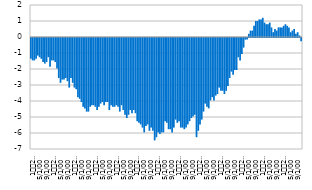
| Category |  Фискални резултат |
|---|---|
| 1
2007. | -1.3 |
| 2 | -1.4 |
| 3 | -1.4 |
| 4 | -1.3 |
| 5 | -1.1 |
| 6 | -1.2 |
| 7 | -1.3 |
| 8 | -1.5 |
| 9 | -1.6 |
| 10 | -1.5 |
| 11 | -1.2 |
| 12 | -1.8 |
| 1
2008. | -1.4 |
| 2 | -1.4 |
| 3 | -1.5 |
| 4 | -1.9 |
| 5 | -2.5 |
| 6 | -2.8 |
| 7 | -2.6 |
| 8 | -2.6 |
| 9 | -2.5 |
| 10 | -2.7 |
| 11 | -3.1 |
| 12 | -2.5 |
| 1
2009. | -2.8 |
| 2 | -3.1 |
| 3 | -3.2 |
| 4 | -3.7 |
| 5 | -3.8 |
| 6 | -4 |
| 7 | -4.3 |
| 8 | -4.4 |
| 9 | -4.6 |
| 10 | -4.6 |
| 11 | -4.3 |
| 12 | -4.2 |
| 1
2010. | -4.2 |
| 2 | -4.3 |
| 3 | -4.5 |
| 4 | -4.3 |
| 5 | -4.1 |
| 6 | -4 |
| 7 | -4.2 |
| 8 | -4 |
| 9 | -4 |
| 10 | -4.5 |
| 11 | -4.2 |
| 12 | -4.3 |
| 1
2011. | -4.3 |
| 2 | -4.2 |
| 3 | -4.3 |
| 4 | -4.6 |
| 5 | -4.2 |
| 6 | -4.5 |
| 7 | -4.8 |
| 8 | -5 |
| 9 | -4.8 |
| 10 | -4.5 |
| 11 | -4.7 |
| 12 | -4.5 |
| 1
2012. | -4.7 |
| 2 | -5.2 |
| 3 | -5.3 |
| 4 | -5.4 |
| 5 | -5.6 |
| 6 | -5.9 |
| 7 | -5.5 |
| 8 | -5.4 |
| 9 | -5.8 |
| 10 | -5.6 |
| 11 | -5.8 |
| 12 | -6.4 |
| 1
2013. | -6.2 |
| 2 | -5.9 |
| 3 | -6 |
| 4 | -5.9 |
| 5 | -5.9 |
| 6 | -5.2 |
| 7 | -5.3 |
| 8 | -5.7 |
| 9 | -5.7 |
| 10 | -5.9 |
| 11 | -5.6 |
| 12 | -5.1 |
| 1
2014. | -5.3 |
| 2 | -5.2 |
| 3 | -5.6 |
| 4 | -5.6 |
| 5 | -5.7 |
| 6 | -5.6 |
| 7 | -5.4 |
| 8 | -5.2 |
| 9 | -5 |
| 10 | -4.9 |
| 11 | -4.8 |
| 12 | -6.2 |
| 1
2015. | -5.8 |
| 2 | -5.4 |
| 3 | -5.1 |
| 4 | -4.6 |
| 5 | -4.1 |
| 6 | -4.3 |
| 7 | -4.4 |
| 8 | -3.9 |
| 9 | -3.7 |
| 10 | -3.9 |
| 11 | -3.6 |
| 12 | -3.5 |
| 1
2016. | -3.1 |
| 2 | -3.3 |
| 3 | -3.3 |
| 4 | -3.5 |
| 5 | -3.3 |
| 6 | -3 |
| 7 | -2.5 |
| 8 | -2.1 |
| 9 | -2.3 |
| 10 | -2 |
| 11 | -2 |
| 12 | -1.2 |
| 1
2017. | -1.4 |
| 2 | -1 |
| 3 | -0.6 |
| 4 | -0.1 |
| 5 | -0.1 |
| 6 | 0.2 |
| 7 | 0.4 |
| 8 | 0.4 |
| 9 | 0.7 |
| 10 | 1 |
| 11 | 1 |
| 12 | 1.1 |
| 1
2018. | 1.1 |
| 2 | 1.2 |
| 3 | 0.9 |
| 4 | 0.8 |
| 5 | 0.8 |
| 6 | 0.9 |
| 7 | 0.6 |
| 8 | 0.3 |
| 9 | 0.5 |
| 10 | 0.4 |
| 11 | 0.6 |
| 12 | 0.6 |
| 1
2019. | 0.6 |
| 2 | 0.7 |
| 3 | 0.8 |
| 4 | 0.7 |
| 5 | 0.6 |
| 6 | 0.3 |
| 7 | 0.4 |
| 8 | 0.5 |
| 9 | 0.2 |
| 10 | 0.3 |
| 11 | 0.1 |
| 12 | -0.2 |